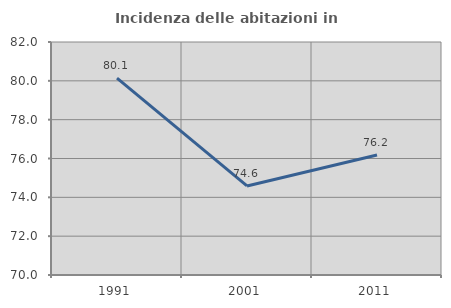
| Category | Incidenza delle abitazioni in proprietà  |
|---|---|
| 1991.0 | 80.136 |
| 2001.0 | 74.588 |
| 2011.0 | 76.179 |